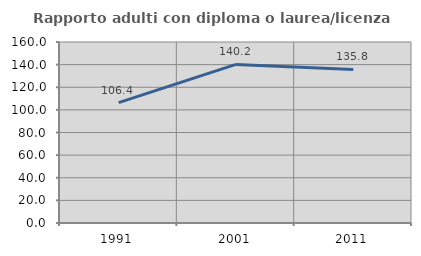
| Category | Rapporto adulti con diploma o laurea/licenza media  |
|---|---|
| 1991.0 | 106.366 |
| 2001.0 | 140.21 |
| 2011.0 | 135.754 |